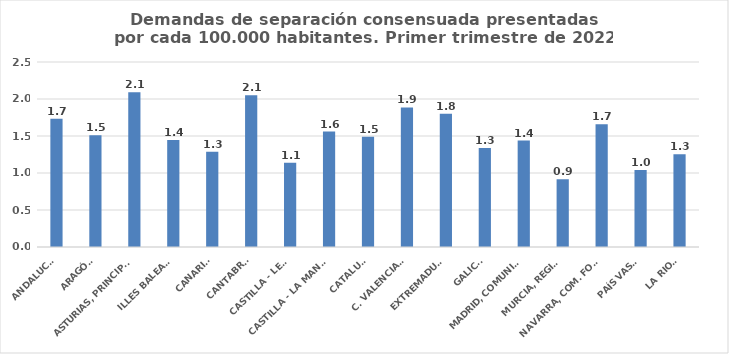
| Category | Series 0 |
|---|---|
| ANDALUCÍA | 1.732 |
| ARAGÓN | 1.509 |
| ASTURIAS, PRINCIPADO | 2.091 |
| ILLES BALEARS | 1.445 |
| CANARIAS | 1.287 |
| CANTABRIA | 2.051 |
| CASTILLA - LEÓN | 1.139 |
| CASTILLA - LA MANCHA | 1.559 |
| CATALUÑA | 1.49 |
| C. VALENCIANA | 1.886 |
| EXTREMADURA | 1.802 |
| GALICIA | 1.339 |
| MADRID, COMUNIDAD | 1.438 |
| MURCIA, REGIÓN | 0.914 |
| NAVARRA, COM. FORAL | 1.658 |
| PAÍS VASCO | 1.042 |
| LA RIOJA | 1.252 |